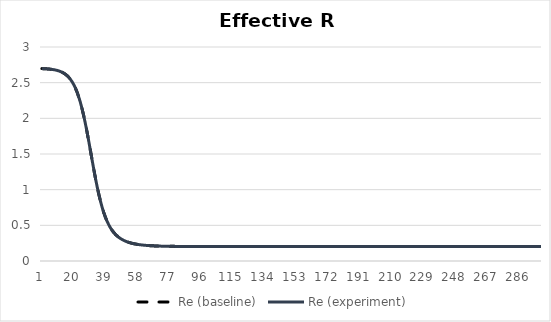
| Category | Re (baseline) | Re (experiment) |
|---|---|---|
| 0 | 2.697 | 2.697 |
| 1 | 2.696 | 2.696 |
| 2 | 2.695 | 2.695 |
| 3 | 2.693 | 2.693 |
| 4 | 2.692 | 2.692 |
| 5 | 2.689 | 2.689 |
| 6 | 2.686 | 2.686 |
| 7 | 2.683 | 2.683 |
| 8 | 2.678 | 2.678 |
| 9 | 2.673 | 2.673 |
| 10 | 2.666 | 2.666 |
| 11 | 2.657 | 2.657 |
| 12 | 2.647 | 2.647 |
| 13 | 2.634 | 2.634 |
| 14 | 2.619 | 2.619 |
| 15 | 2.6 | 2.6 |
| 16 | 2.577 | 2.577 |
| 17 | 2.549 | 2.549 |
| 18 | 2.515 | 2.515 |
| 19 | 2.474 | 2.474 |
| 20 | 2.426 | 2.426 |
| 21 | 2.368 | 2.368 |
| 22 | 2.301 | 2.301 |
| 23 | 2.223 | 2.223 |
| 24 | 2.135 | 2.135 |
| 25 | 2.035 | 2.035 |
| 26 | 1.925 | 1.925 |
| 27 | 1.805 | 1.805 |
| 28 | 1.679 | 1.679 |
| 29 | 1.548 | 1.548 |
| 30 | 1.416 | 1.416 |
| 31 | 1.285 | 1.285 |
| 32 | 1.16 | 1.16 |
| 33 | 1.043 | 1.043 |
| 34 | 0.935 | 0.935 |
| 35 | 0.838 | 0.838 |
| 36 | 0.751 | 0.751 |
| 37 | 0.676 | 0.676 |
| 38 | 0.61 | 0.61 |
| 39 | 0.553 | 0.553 |
| 40 | 0.505 | 0.505 |
| 41 | 0.463 | 0.463 |
| 42 | 0.428 | 0.428 |
| 43 | 0.397 | 0.397 |
| 44 | 0.372 | 0.372 |
| 45 | 0.349 | 0.349 |
| 46 | 0.33 | 0.33 |
| 47 | 0.314 | 0.314 |
| 48 | 0.3 | 0.3 |
| 49 | 0.288 | 0.288 |
| 50 | 0.277 | 0.277 |
| 51 | 0.268 | 0.268 |
| 52 | 0.26 | 0.26 |
| 53 | 0.253 | 0.253 |
| 54 | 0.247 | 0.247 |
| 55 | 0.242 | 0.242 |
| 56 | 0.237 | 0.237 |
| 57 | 0.233 | 0.233 |
| 58 | 0.23 | 0.23 |
| 59 | 0.227 | 0.227 |
| 60 | 0.224 | 0.224 |
| 61 | 0.222 | 0.222 |
| 62 | 0.219 | 0.219 |
| 63 | 0.217 | 0.217 |
| 64 | 0.216 | 0.216 |
| 65 | 0.214 | 0.214 |
| 66 | 0.213 | 0.213 |
| 67 | 0.212 | 0.212 |
| 68 | 0.211 | 0.211 |
| 69 | 0.21 | 0.21 |
| 70 | 0.209 | 0.209 |
| 71 | 0.208 | 0.208 |
| 72 | 0.208 | 0.208 |
| 73 | 0.207 | 0.207 |
| 74 | 0.207 | 0.207 |
| 75 | 0.206 | 0.206 |
| 76 | 0.206 | 0.206 |
| 77 | 0.206 | 0.206 |
| 78 | 0.205 | 0.205 |
| 79 | 0.205 | 0.205 |
| 80 | 0.205 | 0.205 |
| 81 | 0.205 | 0.205 |
| 82 | 0.204 | 0.204 |
| 83 | 0.204 | 0.204 |
| 84 | 0.204 | 0.204 |
| 85 | 0.204 | 0.204 |
| 86 | 0.204 | 0.204 |
| 87 | 0.204 | 0.204 |
| 88 | 0.204 | 0.204 |
| 89 | 0.204 | 0.204 |
| 90 | 0.204 | 0.204 |
| 91 | 0.203 | 0.203 |
| 92 | 0.203 | 0.203 |
| 93 | 0.203 | 0.203 |
| 94 | 0.203 | 0.203 |
| 95 | 0.203 | 0.203 |
| 96 | 0.203 | 0.203 |
| 97 | 0.203 | 0.203 |
| 98 | 0.203 | 0.203 |
| 99 | 0.203 | 0.203 |
| 100 | 0.203 | 0.203 |
| 101 | 0.203 | 0.203 |
| 102 | 0.203 | 0.203 |
| 103 | 0.203 | 0.203 |
| 104 | 0.203 | 0.203 |
| 105 | 0.203 | 0.203 |
| 106 | 0.203 | 0.203 |
| 107 | 0.203 | 0.203 |
| 108 | 0.203 | 0.203 |
| 109 | 0.203 | 0.203 |
| 110 | 0.203 | 0.203 |
| 111 | 0.203 | 0.203 |
| 112 | 0.203 | 0.203 |
| 113 | 0.203 | 0.203 |
| 114 | 0.203 | 0.203 |
| 115 | 0.203 | 0.203 |
| 116 | 0.203 | 0.203 |
| 117 | 0.203 | 0.203 |
| 118 | 0.203 | 0.203 |
| 119 | 0.203 | 0.203 |
| 120 | 0.203 | 0.203 |
| 121 | 0.203 | 0.203 |
| 122 | 0.203 | 0.203 |
| 123 | 0.203 | 0.203 |
| 124 | 0.203 | 0.203 |
| 125 | 0.203 | 0.203 |
| 126 | 0.203 | 0.203 |
| 127 | 0.203 | 0.203 |
| 128 | 0.203 | 0.203 |
| 129 | 0.203 | 0.203 |
| 130 | 0.203 | 0.203 |
| 131 | 0.203 | 0.203 |
| 132 | 0.203 | 0.203 |
| 133 | 0.203 | 0.203 |
| 134 | 0.203 | 0.203 |
| 135 | 0.203 | 0.203 |
| 136 | 0.203 | 0.203 |
| 137 | 0.203 | 0.203 |
| 138 | 0.203 | 0.203 |
| 139 | 0.203 | 0.203 |
| 140 | 0.203 | 0.203 |
| 141 | 0.203 | 0.203 |
| 142 | 0.203 | 0.203 |
| 143 | 0.203 | 0.203 |
| 144 | 0.203 | 0.203 |
| 145 | 0.203 | 0.203 |
| 146 | 0.203 | 0.203 |
| 147 | 0.203 | 0.203 |
| 148 | 0.203 | 0.203 |
| 149 | 0.203 | 0.203 |
| 150 | 0.203 | 0.203 |
| 151 | 0.203 | 0.203 |
| 152 | 0.203 | 0.203 |
| 153 | 0.203 | 0.203 |
| 154 | 0.203 | 0.203 |
| 155 | 0.203 | 0.203 |
| 156 | 0.203 | 0.203 |
| 157 | 0.203 | 0.203 |
| 158 | 0.203 | 0.203 |
| 159 | 0.203 | 0.203 |
| 160 | 0.203 | 0.203 |
| 161 | 0.203 | 0.203 |
| 162 | 0.203 | 0.203 |
| 163 | 0.203 | 0.203 |
| 164 | 0.203 | 0.203 |
| 165 | 0.203 | 0.203 |
| 166 | 0.203 | 0.203 |
| 167 | 0.203 | 0.203 |
| 168 | 0.203 | 0.203 |
| 169 | 0.203 | 0.203 |
| 170 | 0.203 | 0.203 |
| 171 | 0.203 | 0.203 |
| 172 | 0.203 | 0.203 |
| 173 | 0.203 | 0.203 |
| 174 | 0.203 | 0.203 |
| 175 | 0.203 | 0.203 |
| 176 | 0.203 | 0.203 |
| 177 | 0.203 | 0.203 |
| 178 | 0.203 | 0.203 |
| 179 | 0.203 | 0.203 |
| 180 | 0.203 | 0.203 |
| 181 | 0.203 | 0.203 |
| 182 | 0.203 | 0.203 |
| 183 | 0.203 | 0.203 |
| 184 | 0.203 | 0.203 |
| 185 | 0.203 | 0.203 |
| 186 | 0.203 | 0.203 |
| 187 | 0.203 | 0.203 |
| 188 | 0.203 | 0.203 |
| 189 | 0.203 | 0.203 |
| 190 | 0.203 | 0.203 |
| 191 | 0.203 | 0.203 |
| 192 | 0.203 | 0.203 |
| 193 | 0.203 | 0.203 |
| 194 | 0.203 | 0.203 |
| 195 | 0.203 | 0.203 |
| 196 | 0.203 | 0.203 |
| 197 | 0.203 | 0.203 |
| 198 | 0.203 | 0.203 |
| 199 | 0.203 | 0.203 |
| 200 | 0.203 | 0.203 |
| 201 | 0.203 | 0.203 |
| 202 | 0.203 | 0.203 |
| 203 | 0.203 | 0.203 |
| 204 | 0.203 | 0.203 |
| 205 | 0.203 | 0.203 |
| 206 | 0.203 | 0.203 |
| 207 | 0.203 | 0.203 |
| 208 | 0.203 | 0.203 |
| 209 | 0.203 | 0.203 |
| 210 | 0.203 | 0.203 |
| 211 | 0.203 | 0.203 |
| 212 | 0.203 | 0.203 |
| 213 | 0.203 | 0.203 |
| 214 | 0.203 | 0.203 |
| 215 | 0.203 | 0.203 |
| 216 | 0.203 | 0.203 |
| 217 | 0.203 | 0.203 |
| 218 | 0.203 | 0.203 |
| 219 | 0.203 | 0.203 |
| 220 | 0.203 | 0.203 |
| 221 | 0.203 | 0.203 |
| 222 | 0.203 | 0.203 |
| 223 | 0.203 | 0.203 |
| 224 | 0.203 | 0.203 |
| 225 | 0.203 | 0.203 |
| 226 | 0.203 | 0.203 |
| 227 | 0.203 | 0.203 |
| 228 | 0.203 | 0.203 |
| 229 | 0.203 | 0.203 |
| 230 | 0.203 | 0.203 |
| 231 | 0.203 | 0.203 |
| 232 | 0.203 | 0.203 |
| 233 | 0.203 | 0.203 |
| 234 | 0.203 | 0.203 |
| 235 | 0.203 | 0.203 |
| 236 | 0.203 | 0.203 |
| 237 | 0.203 | 0.203 |
| 238 | 0.203 | 0.203 |
| 239 | 0.203 | 0.203 |
| 240 | 0.203 | 0.203 |
| 241 | 0.203 | 0.203 |
| 242 | 0.203 | 0.203 |
| 243 | 0.203 | 0.203 |
| 244 | 0.203 | 0.203 |
| 245 | 0.203 | 0.203 |
| 246 | 0.203 | 0.203 |
| 247 | 0.203 | 0.203 |
| 248 | 0.203 | 0.203 |
| 249 | 0.203 | 0.203 |
| 250 | 0.203 | 0.203 |
| 251 | 0.203 | 0.203 |
| 252 | 0.203 | 0.203 |
| 253 | 0.203 | 0.203 |
| 254 | 0.203 | 0.203 |
| 255 | 0.203 | 0.203 |
| 256 | 0.203 | 0.203 |
| 257 | 0.203 | 0.203 |
| 258 | 0.203 | 0.203 |
| 259 | 0.203 | 0.203 |
| 260 | 0.203 | 0.203 |
| 261 | 0.203 | 0.203 |
| 262 | 0.203 | 0.203 |
| 263 | 0.203 | 0.203 |
| 264 | 0.203 | 0.203 |
| 265 | 0.203 | 0.203 |
| 266 | 0.203 | 0.203 |
| 267 | 0.203 | 0.203 |
| 268 | 0.203 | 0.203 |
| 269 | 0.203 | 0.203 |
| 270 | 0.203 | 0.203 |
| 271 | 0.203 | 0.203 |
| 272 | 0.203 | 0.203 |
| 273 | 0.203 | 0.203 |
| 274 | 0.203 | 0.203 |
| 275 | 0.203 | 0.203 |
| 276 | 0.203 | 0.203 |
| 277 | 0.203 | 0.203 |
| 278 | 0.203 | 0.203 |
| 279 | 0.203 | 0.203 |
| 280 | 0.203 | 0.203 |
| 281 | 0.203 | 0.203 |
| 282 | 0.203 | 0.203 |
| 283 | 0.203 | 0.203 |
| 284 | 0.203 | 0.203 |
| 285 | 0.203 | 0.203 |
| 286 | 0.203 | 0.203 |
| 287 | 0.203 | 0.203 |
| 288 | 0.203 | 0.203 |
| 289 | 0.203 | 0.203 |
| 290 | 0.203 | 0.203 |
| 291 | 0.203 | 0.203 |
| 292 | 0.203 | 0.203 |
| 293 | 0.203 | 0.203 |
| 294 | 0.203 | 0.203 |
| 295 | 0.203 | 0.203 |
| 296 | 0.203 | 0.203 |
| 297 | 0.203 | 0.203 |
| 298 | 0.203 | 0.203 |